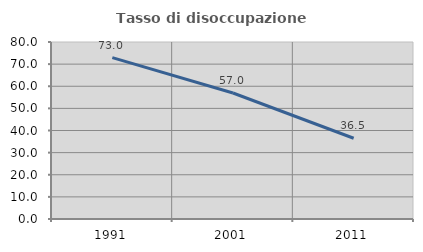
| Category | Tasso di disoccupazione giovanile  |
|---|---|
| 1991.0 | 72.951 |
| 2001.0 | 56.962 |
| 2011.0 | 36.508 |